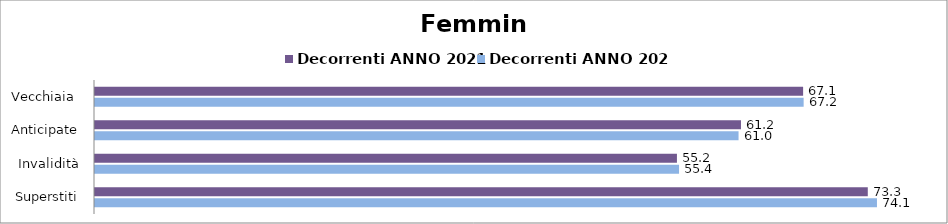
| Category | Decorrenti ANNO 2021 | Decorrenti ANNO 2022 |
|---|---|---|
| Vecchiaia  | 67.12 | 67.17 |
| Anticipate | 61.23 | 61 |
| Invalidità | 55.16 | 55.36 |
| Superstiti | 73.25 | 74.12 |